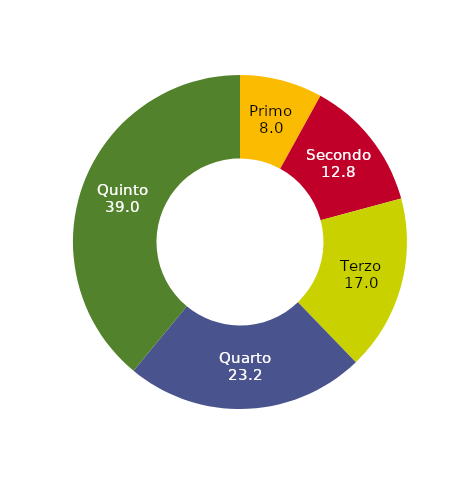
| Category | Series 0 |
|---|---|
| Primo | 8 |
| Secondo | 12.8 |
| Terzo | 17 |
| Quarto | 23.2 |
| Quinto | 39 |